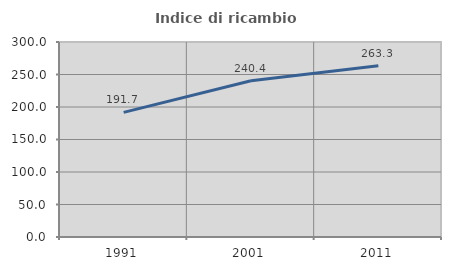
| Category | Indice di ricambio occupazionale  |
|---|---|
| 1991.0 | 191.667 |
| 2001.0 | 240.426 |
| 2011.0 | 263.333 |